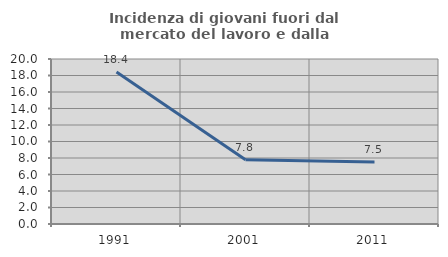
| Category | Incidenza di giovani fuori dal mercato del lavoro e dalla formazione  |
|---|---|
| 1991.0 | 18.421 |
| 2001.0 | 7.792 |
| 2011.0 | 7.527 |